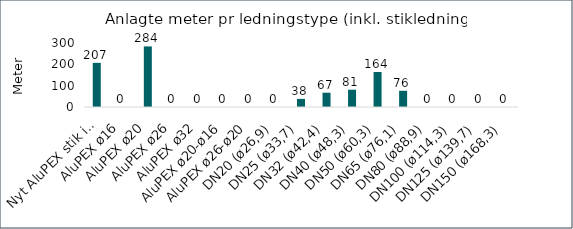
| Category | Series 1 |
|---|---|
| Nyt AluPEX stik inkl. Tracé | 207 |
| AluPEX ø16 | 0 |
| AluPEX ø20 | 284 |
| AluPEX ø26 | 0 |
| AluPEX ø32 | 0 |
| AluPEX ø20-ø16 | 0 |
| AluPEX ø26-ø20 | 0 |
| DN20 (ø26,9) | 0 |
| DN25 (ø33,7) | 38 |
| DN32 (ø42,4) | 67 |
| DN40 (ø48,3) | 81 |
| DN50 (ø60,3) | 164 |
| DN65 (ø76,1) | 76 |
| DN80 (ø88,9) | 0 |
| DN100 (ø114,3) | 0 |
| DN125 (ø139,7) | 0 |
| DN150 (ø168,3) | 0 |